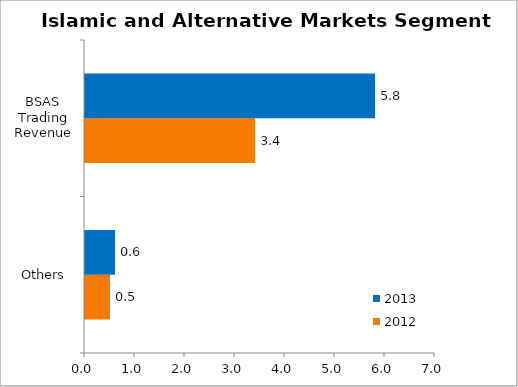
| Category | 2012 | 2013 |
|---|---|---|
| Others  | 0.5 | 0.6 |
| BSAS Trading Revenue | 3.4 | 5.8 |